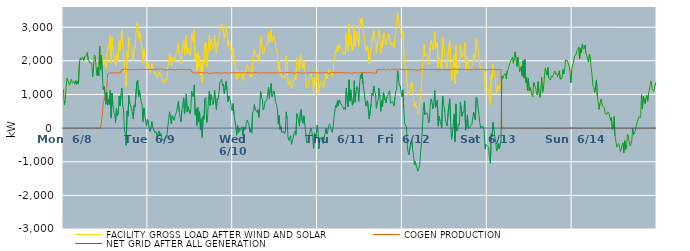
| Category | FACILITY GROSS LOAD AFTER WIND AND SOLAR | COGEN PRODUCTION | NET GRID AFTER ALL GENERATION |
|---|---|---|---|
|  Mon  6/8 | 1149 | 0 | 1149 |
|  Mon  6/8 | 692 | 0 | 692 |
|  Mon  6/8 | 806 | 0 | 806 |
|  Mon  6/8 | 1212 | 0 | 1212 |
|  Mon  6/8 | 1478 | 0 | 1478 |
|  Mon  6/8 | 1409 | 0 | 1409 |
|  Mon  6/8 | 1383 | 0 | 1383 |
|  Mon  6/8 | 1277 | 0 | 1277 |
|  Mon  6/8 | 1256 | 0 | 1256 |
|  Mon  6/8 | 1450 | 0 | 1450 |
|  Mon  6/8 | 1342 | 0 | 1342 |
|  Mon  6/8 | 1341 | 0 | 1341 |
|  Mon  6/8 | 1388 | 0 | 1388 |
|  Mon  6/8 | 1303 | 0 | 1303 |
|  Mon  6/8 | 1413 | 0 | 1413 |
|  Mon  6/8 | 1302 | 0 | 1302 |
|  Mon  6/8 | 1396 | 0 | 1396 |
|  Mon  6/8 | 1310 | 0 | 1310 |
|  Mon  6/8 | 1901 | 0 | 1901 |
|  Mon  6/8 | 2096 | 0 | 2096 |
|  Mon  6/8 | 2030 | 0 | 2030 |
|  Mon  6/8 | 2065 | 0 | 2065 |
|  Mon  6/8 | 2110 | 0 | 2110 |
|  Mon  6/8 | 2014 | 0 | 2014 |
|  Mon  6/8 | 2131 | 0 | 2131 |
|  Mon  6/8 | 2127 | 0 | 2127 |
|  Mon  6/8 | 2157 | 0 | 2157 |
|  Mon  6/8 | 2244 | 0 | 2244 |
|  Mon  6/8 | 2032 | 0 | 2032 |
|  Mon  6/8 | 1995 | 0 | 1995 |
|  Mon  6/8 | 1935 | 0 | 1935 |
|  Mon  6/8 | 1937 | 0 | 1937 |
|  Mon  6/8 | 1936 | 0 | 1936 |
|  Mon  6/8 | 1520 | 0 | 1520 |
|  Mon  6/8 | 1823 | 0 | 1823 |
|  Mon  6/8 | 2174 | 0 | 2174 |
|  Mon  6/8 | 2131 | 0 | 2131 |
|  Mon  6/8 | 1795 | 0 | 1795 |
|  Mon  6/8 | 1562 | 0 | 1562 |
|  Mon  6/8 | 1802 | 0 | 1802 |
|  Mon  6/8 | 1553 | 0 | 1553 |
|  Mon  6/8 | 2439 | 0 | 2439 |
|  Mon  6/8 | 1746 | 0 | 1746 |
|  Mon  6/8 | 2171 | 0 | 2171 |
|  Mon  6/8 | 2010 | 393 | 1617 |
|  Mon  6/8 | 1881 | 732 | 1149 |
|  Mon  6/8 | 1976 | 744 | 1232 |
|  Mon  6/8 | 1930 | 933 | 997 |
|  Mon  6/8 | 1753 | 1044 | 709 |
|  Mon  6/8 | 2226 | 1165 | 1061 |
|  Mon  6/8 | 2290 | 1608 | 682 |
|  Mon  6/8 | 2489 | 1632 | 857 |
|  Mon  6/8 | 2347 | 1638 | 709 |
|  Mon  6/8 | 2765 | 1636 | 1129 |
|  Mon  6/8 | 1937 | 1640 | 297 |
|  Mon  6/8 | 2681 | 1642 | 1039 |
|  Mon  6/8 | 2311 | 1638 | 673 |
|  Mon  6/8 | 2128 | 1663 | 465 |
|  Mon  6/8 | 2061 | 1644 | 417 |
|  Mon  6/8 | 1816 | 1650 | 166 |
|  Mon  6/8 | 2233 | 1641 | 592 |
|  Mon  6/8 | 1989 | 1627 | 362 |
|  Mon  6/8 | 2039 | 1643 | 396 |
|  Mon  6/8 | 2594 | 1640 | 954 |
|  Mon  6/8 | 2303 | 1636 | 667 |
|  Mon  6/8 | 2610 | 1636 | 974 |
|  Mon  6/8 | 2929 | 1741 | 1188 |
|  Mon  6/8 | 2434 | 1738 | 696 |
|  Mon  6/8 | 2251 | 1739 | 512 |
|  Mon  6/8 | 1725 | 1747 | -22 |
|  Mon  6/8 | 1593 | 1758 | -165 |
|  Mon  6/8 | 1234 | 1745 | -511 |
|  Mon  6/8 | 2251 | 1742 | 509 |
|  Mon  6/8 | 2103 | 1753 | 350 |
|  Mon  6/8 | 2705 | 1737 | 968 |
|  Mon  6/8 | 2470 | 1745 | 725 |
|  Mon  6/8 | 2462 | 1739 | 723 |
|  Mon  6/8 | 2335 | 1751 | 584 |
|  Mon  6/8 | 2182 | 1748 | 434 |
|  Mon  6/8 | 2011 | 1737 | 274 |
|  Mon  6/8 | 2413 | 1735 | 678 |
|  Mon  6/8 | 2374 | 1752 | 622 |
|  Mon  6/8 | 2386 | 1742 | 644 |
|  Mon  6/8 | 3116 | 1743 | 1373 |
|  Mon  6/8 | 3164 | 1739 | 1425 |
|  Mon  6/8 | 2669 | 1732 | 937 |
|  Mon  6/8 | 2870 | 1747 | 1123 |
|  Mon  6/8 | 2641 | 1732 | 909 |
|  Mon  6/8 | 2519 | 1745 | 774 |
|  Mon  6/8 | 2409 | 1742 | 667 |
|  Mon  6/8 | 1943 | 1750 | 193 |
|  Mon  6/8 | 2337 | 1739 | 598 |
|  Mon  6/8 | 2138 | 1744 | 394 |
|  Mon  6/8 | 1963 | 1750 | 213 |
|  Mon  6/8 | 1803 | 1746 | 57 |
|  Mon  6/8 | 1988 | 1725 | 263 |
|  Tue  6/9 | 1919 | 1735 | 184 |
|  Tue  6/9 | 1724 | 1736 | -12 |
|  Tue  6/9 | 1639 | 1744 | -105 |
|  Tue  6/9 | 1721 | 1743 | -22 |
|  Tue  6/9 | 1943 | 1747 | 196 |
|  Tue  6/9 | 1788 | 1763 | 25 |
|  Tue  6/9 | 1714 | 1735 | -21 |
|  Tue  6/9 | 1609 | 1731 | -122 |
|  Tue  6/9 | 1660 | 1753 | -93 |
|  Tue  6/9 | 1633 | 1745 | -112 |
|  Tue  6/9 | 1486 | 1755 | -269 |
|  Tue  6/9 | 1585 | 1755 | -170 |
|  Tue  6/9 | 1668 | 1754 | -86 |
|  Tue  6/9 | 1547 | 1755 | -208 |
|  Tue  6/9 | 1616 | 1761 | -145 |
|  Tue  6/9 | 1480 | 1744 | -264 |
|  Tue  6/9 | 1471 | 1754 | -283 |
|  Tue  6/9 | 1380 | 1759 | -379 |
|  Tue  6/9 | 1339 | 1738 | -399 |
|  Tue  6/9 | 1448 | 1750 | -302 |
|  Tue  6/9 | 1400 | 1723 | -323 |
|  Tue  6/9 | 1455 | 1730 | -275 |
|  Tue  6/9 | 1770 | 1736 | 34 |
|  Tue  6/9 | 1962 | 1729 | 233 |
|  Tue  6/9 | 2235 | 1752 | 483 |
|  Tue  6/9 | 2051 | 1732 | 319 |
|  Tue  6/9 | 1866 | 1740 | 126 |
|  Tue  6/9 | 2113 | 1744 | 369 |
|  Tue  6/9 | 2068 | 1739 | 329 |
|  Tue  6/9 | 1968 | 1737 | 231 |
|  Tue  6/9 | 2073 | 1728 | 345 |
|  Tue  6/9 | 2063 | 1740 | 323 |
|  Tue  6/9 | 2221 | 1737 | 484 |
|  Tue  6/9 | 2379 | 1730 | 649 |
|  Tue  6/9 | 2536 | 1744 | 792 |
|  Tue  6/9 | 2215 | 1729 | 486 |
|  Tue  6/9 | 2084 | 1743 | 341 |
|  Tue  6/9 | 1933 | 1753 | 180 |
|  Tue  6/9 | 2271 | 1746 | 525 |
|  Tue  6/9 | 2429 | 1732 | 697 |
|  Tue  6/9 | 2636 | 1734 | 902 |
|  Tue  6/9 | 2152 | 1734 | 418 |
|  Tue  6/9 | 2496 | 1738 | 758 |
|  Tue  6/9 | 2762 | 1744 | 1018 |
|  Tue  6/9 | 2205 | 1728 | 477 |
|  Tue  6/9 | 2371 | 1734 | 637 |
|  Tue  6/9 | 2396 | 1749 | 647 |
|  Tue  6/9 | 2161 | 1729 | 432 |
|  Tue  6/9 | 2248 | 1746 | 502 |
|  Tue  6/9 | 2830 | 1734 | 1096 |
|  Tue  6/9 | 2611 | 1647 | 964 |
|  Tue  6/9 | 2574 | 1648 | 926 |
|  Tue  6/9 | 2924 | 1639 | 1285 |
|  Tue  6/9 | 2042 | 1646 | 396 |
|  Tue  6/9 | 2208 | 1635 | 573 |
|  Tue  6/9 | 1707 | 1629 | 78 |
|  Tue  6/9 | 2250 | 1640 | 610 |
|  Tue  6/9 | 1831 | 1641 | 190 |
|  Tue  6/9 | 2128 | 1644 | 484 |
|  Tue  6/9 | 1589 | 1635 | -46 |
|  Tue  6/9 | 1935 | 1649 | 286 |
|  Tue  6/9 | 1357 | 1634 | -277 |
|  Tue  6/9 | 2001 | 1636 | 365 |
|  Tue  6/9 | 1903 | 1640 | 263 |
|  Tue  6/9 | 2503 | 1634 | 869 |
|  Tue  6/9 | 2560 | 1643 | 917 |
|  Tue  6/9 | 1817 | 1658 | 159 |
|  Tue  6/9 | 1929 | 1637 | 292 |
|  Tue  6/9 | 2455 | 1629 | 826 |
|  Tue  6/9 | 2749 | 1648 | 1101 |
|  Tue  6/9 | 2303 | 1631 | 672 |
|  Tue  6/9 | 2635 | 1636 | 999 |
|  Tue  6/9 | 2492 | 1638 | 854 |
|  Tue  6/9 | 2345 | 1651 | 694 |
|  Tue  6/9 | 2421 | 1633 | 788 |
|  Tue  6/9 | 2767 | 1644 | 1123 |
|  Tue  6/9 | 2425 | 1648 | 777 |
|  Tue  6/9 | 2215 | 1666 | 549 |
|  Tue  6/9 | 2527 | 1642 | 885 |
|  Tue  6/9 | 2483 | 1636 | 847 |
|  Tue  6/9 | 2685 | 1640 | 1045 |
|  Tue  6/9 | 3001 | 1636 | 1365 |
|  Tue  6/9 | 3038 | 1635 | 1403 |
|  Tue  6/9 | 3099 | 1647 | 1452 |
|  Tue  6/9 | 2881 | 1629 | 1252 |
|  Tue  6/9 | 2947 | 1636 | 1311 |
|  Tue  6/9 | 2666 | 1650 | 1016 |
|  Tue  6/9 | 2700 | 1655 | 1045 |
|  Tue  6/9 | 3030 | 1643 | 1387 |
|  Tue  6/9 | 2800 | 1650 | 1150 |
|  Tue  6/9 | 2414 | 1635 | 779 |
|  Tue  6/9 | 2601 | 1645 | 956 |
|  Tue  6/9 | 2505 | 1636 | 869 |
|  Tue  6/9 | 2451 | 1645 | 806 |
|  Tue  6/9 | 2242 | 1643 | 599 |
|  Tue  6/9 | 2164 | 1652 | 512 |
|  Wed  6/10 | 2378 | 1646 | 732 |
|  Wed  6/10 | 2049 | 1653 | 396 |
|  Wed  6/10 | 1858 | 1643 | 215 |
|  Wed  6/10 | 1694 | 1640 | 54 |
|  Wed  6/10 | 1436 | 1646 | -210 |
|  Wed  6/10 | 1713 | 1640 | 73 |
|  Wed  6/10 | 1501 | 1642 | -141 |
|  Wed  6/10 | 1639 | 1641 | -2 |
|  Wed  6/10 | 1559 | 1631 | -72 |
|  Wed  6/10 | 1595 | 1651 | -56 |
|  Wed  6/10 | 1685 | 1646 | 39 |
|  Wed  6/10 | 1417 | 1635 | -218 |
|  Wed  6/10 | 1676 | 1643 | 33 |
|  Wed  6/10 | 1577 | 1640 | -63 |
|  Wed  6/10 | 1636 | 1638 | -2 |
|  Wed  6/10 | 1846 | 1648 | 198 |
|  Wed  6/10 | 1891 | 1650 | 241 |
|  Wed  6/10 | 1901 | 1647 | 254 |
|  Wed  6/10 | 1715 | 1643 | 72 |
|  Wed  6/10 | 1527 | 1647 | -120 |
|  Wed  6/10 | 1614 | 1638 | -24 |
|  Wed  6/10 | 1510 | 1658 | -148 |
|  Wed  6/10 | 2097 | 1639 | 458 |
|  Wed  6/10 | 2149 | 1629 | 520 |
|  Wed  6/10 | 2348 | 1651 | 697 |
|  Wed  6/10 | 2188 | 1645 | 543 |
|  Wed  6/10 | 2180 | 1662 | 518 |
|  Wed  6/10 | 2114 | 1643 | 471 |
|  Wed  6/10 | 2186 | 1635 | 551 |
|  Wed  6/10 | 1958 | 1640 | 318 |
|  Wed  6/10 | 2220 | 1646 | 574 |
|  Wed  6/10 | 2736 | 1640 | 1096 |
|  Wed  6/10 | 2549 | 1628 | 921 |
|  Wed  6/10 | 2492 | 1636 | 856 |
|  Wed  6/10 | 2193 | 1655 | 538 |
|  Wed  6/10 | 2260 | 1646 | 614 |
|  Wed  6/10 | 2424 | 1631 | 793 |
|  Wed  6/10 | 2440 | 1635 | 805 |
|  Wed  6/10 | 2454 | 1637 | 817 |
|  Wed  6/10 | 2647 | 1633 | 1014 |
|  Wed  6/10 | 2857 | 1651 | 1206 |
|  Wed  6/10 | 2531 | 1648 | 883 |
|  Wed  6/10 | 2801 | 1635 | 1166 |
|  Wed  6/10 | 2952 | 1628 | 1324 |
|  Wed  6/10 | 2574 | 1644 | 930 |
|  Wed  6/10 | 2638 | 1658 | 980 |
|  Wed  6/10 | 2745 | 1638 | 1107 |
|  Wed  6/10 | 2632 | 1630 | 1002 |
|  Wed  6/10 | 2412 | 1648 | 764 |
|  Wed  6/10 | 2347 | 1639 | 708 |
|  Wed  6/10 | 2209 | 1640 | 569 |
|  Wed  6/10 | 1747 | 1630 | 117 |
|  Wed  6/10 | 2025 | 1641 | 384 |
|  Wed  6/10 | 1592 | 1635 | -43 |
|  Wed  6/10 | 1694 | 1645 | 49 |
|  Wed  6/10 | 1504 | 1641 | -137 |
|  Wed  6/10 | 1480 | 1644 | -164 |
|  Wed  6/10 | 1554 | 1635 | -81 |
|  Wed  6/10 | 1466 | 1633 | -167 |
|  Wed  6/10 | 1546 | 1655 | -109 |
|  Wed  6/10 | 2133 | 1650 | 483 |
|  Wed  6/10 | 1906 | 1622 | 284 |
|  Wed  6/10 | 1388 | 1654 | -266 |
|  Wed  6/10 | 1283 | 1652 | -369 |
|  Wed  6/10 | 1361 | 1639 | -278 |
|  Wed  6/10 | 1418 | 1645 | -227 |
|  Wed  6/10 | 1178 | 1662 | -484 |
|  Wed  6/10 | 1266 | 1633 | -367 |
|  Wed  6/10 | 1359 | 1636 | -277 |
|  Wed  6/10 | 1511 | 1649 | -138 |
|  Wed  6/10 | 1545 | 1634 | -89 |
|  Wed  6/10 | 1433 | 1642 | -209 |
|  Wed  6/10 | 2067 | 1640 | 427 |
|  Wed  6/10 | 2007 | 1637 | 370 |
|  Wed  6/10 | 1999 | 1647 | 352 |
|  Wed  6/10 | 1703 | 1648 | 55 |
|  Wed  6/10 | 2136 | 1647 | 489 |
|  Wed  6/10 | 2181 | 1629 | 552 |
|  Wed  6/10 | 1849 | 1630 | 219 |
|  Wed  6/10 | 1768 | 1628 | 140 |
|  Wed  6/10 | 1999 | 1633 | 366 |
|  Wed  6/10 | 1750 | 1639 | 111 |
|  Wed  6/10 | 1553 | 1644 | -91 |
|  Wed  6/10 | 1209 | 1639 | -430 |
|  Wed  6/10 | 1231 | 1636 | -405 |
|  Wed  6/10 | 1248 | 1640 | -392 |
|  Wed  6/10 | 1438 | 1640 | -202 |
|  Wed  6/10 | 1450 | 1649 | -199 |
|  Wed  6/10 | 1642 | 1646 | -4 |
|  Wed  6/10 | 1529 | 1630 | -101 |
|  Wed  6/10 | 1361 | 1639 | -278 |
|  Wed  6/10 | 1038 | 1641 | -603 |
|  Wed  6/10 | 1503 | 1653 | -150 |
|  Wed  6/10 | 1261 | 1646 | -385 |
|  Wed  6/10 | 1465 | 1646 | -181 |
|  Wed  6/10 | 1725 | 1641 | 84 |
|  Thu  6/11 | 1524 | 1629 | -105 |
|  Thu  6/11 | 1020 | 1636 | -616 |
|  Thu  6/11 | 1302 | 1650 | -348 |
|  Thu  6/11 | 1376 | 1658 | -282 |
|  Thu  6/11 | 1314 | 1633 | -319 |
|  Thu  6/11 | 1265 | 1638 | -373 |
|  Thu  6/11 | 1198 | 1650 | -452 |
|  Thu  6/11 | 1386 | 1652 | -266 |
|  Thu  6/11 | 1459 | 1649 | -190 |
|  Thu  6/11 | 1631 | 1640 | -9 |
|  Thu  6/11 | 1470 | 1640 | -170 |
|  Thu  6/11 | 1550 | 1650 | -100 |
|  Thu  6/11 | 1700 | 1630 | 70 |
|  Thu  6/11 | 1763 | 1639 | 124 |
|  Thu  6/11 | 1716 | 1639 | 77 |
|  Thu  6/11 | 1576 | 1652 | -76 |
|  Thu  6/11 | 1534 | 1662 | -128 |
|  Thu  6/11 | 1643 | 1646 | -3 |
|  Thu  6/11 | 1950 | 1643 | 307 |
|  Thu  6/11 | 2137 | 1655 | 482 |
|  Thu  6/11 | 2325 | 1641 | 684 |
|  Thu  6/11 | 2256 | 1641 | 615 |
|  Thu  6/11 | 2471 | 1658 | 813 |
|  Thu  6/11 | 2287 | 1631 | 656 |
|  Thu  6/11 | 2485 | 1647 | 838 |
|  Thu  6/11 | 2411 | 1640 | 771 |
|  Thu  6/11 | 2366 | 1645 | 721 |
|  Thu  6/11 | 2362 | 1640 | 722 |
|  Thu  6/11 | 2291 | 1650 | 641 |
|  Thu  6/11 | 2191 | 1637 | 554 |
|  Thu  6/11 | 2267 | 1649 | 618 |
|  Thu  6/11 | 2192 | 1643 | 549 |
|  Thu  6/11 | 2824 | 1634 | 1190 |
|  Thu  6/11 | 2501 | 1640 | 861 |
|  Thu  6/11 | 2285 | 1652 | 633 |
|  Thu  6/11 | 3082 | 1647 | 1435 |
|  Thu  6/11 | 2442 | 1640 | 802 |
|  Thu  6/11 | 2779 | 1641 | 1138 |
|  Thu  6/11 | 2786 | 1627 | 1159 |
|  Thu  6/11 | 2312 | 1635 | 677 |
|  Thu  6/11 | 2368 | 1636 | 732 |
|  Thu  6/11 | 3056 | 1648 | 1408 |
|  Thu  6/11 | 2424 | 1655 | 769 |
|  Thu  6/11 | 2709 | 1627 | 1082 |
|  Thu  6/11 | 2878 | 1637 | 1241 |
|  Thu  6/11 | 2855 | 1650 | 1205 |
|  Thu  6/11 | 2425 | 1636 | 789 |
|  Thu  6/11 | 2930 | 1642 | 1288 |
|  Thu  6/11 | 3237 | 1651 | 1586 |
|  Thu  6/11 | 3118 | 1642 | 1476 |
|  Thu  6/11 | 3285 | 1650 | 1635 |
|  Thu  6/11 | 2954 | 1644 | 1310 |
|  Thu  6/11 | 2787 | 1657 | 1130 |
|  Thu  6/11 | 2778 | 1630 | 1148 |
|  Thu  6/11 | 2297 | 1641 | 656 |
|  Thu  6/11 | 2310 | 1642 | 668 |
|  Thu  6/11 | 2456 | 1645 | 811 |
|  Thu  6/11 | 2475 | 1649 | 826 |
|  Thu  6/11 | 1916 | 1645 | 271 |
|  Thu  6/11 | 1928 | 1636 | 292 |
|  Thu  6/11 | 2357 | 1644 | 713 |
|  Thu  6/11 | 2671 | 1637 | 1034 |
|  Thu  6/11 | 2601 | 1640 | 961 |
|  Thu  6/11 | 2896 | 1645 | 1251 |
|  Thu  6/11 | 2739 | 1629 | 1110 |
|  Thu  6/11 | 2665 | 1650 | 1015 |
|  Thu  6/11 | 2226 | 1639 | 587 |
|  Thu  6/11 | 2543 | 1748 | 795 |
|  Thu  6/11 | 2566 | 1737 | 829 |
|  Thu  6/11 | 2924 | 1735 | 1189 |
|  Thu  6/11 | 2677 | 1750 | 927 |
|  Thu  6/11 | 2239 | 1741 | 498 |
|  Thu  6/11 | 2578 | 1750 | 828 |
|  Thu  6/11 | 2386 | 1743 | 643 |
|  Thu  6/11 | 2803 | 1742 | 1061 |
|  Thu  6/11 | 2838 | 1754 | 1084 |
|  Thu  6/11 | 2562 | 1734 | 828 |
|  Thu  6/11 | 2476 | 1724 | 752 |
|  Thu  6/11 | 2659 | 1724 | 935 |
|  Thu  6/11 | 2739 | 1758 | 981 |
|  Thu  6/11 | 2811 | 1750 | 1061 |
|  Thu  6/11 | 2827 | 1719 | 1108 |
|  Thu  6/11 | 2477 | 1744 | 733 |
|  Thu  6/11 | 2488 | 1746 | 742 |
|  Thu  6/11 | 2529 | 1741 | 788 |
|  Thu  6/11 | 2514 | 1743 | 771 |
|  Thu  6/11 | 2397 | 1729 | 668 |
|  Thu  6/11 | 2675 | 1764 | 911 |
|  Thu  6/11 | 2861 | 1761 | 1100 |
|  Thu  6/11 | 2881 | 1727 | 1154 |
|  Thu  6/11 | 3451 | 1747 | 1704 |
|  Thu  6/11 | 3211 | 1736 | 1475 |
|  Thu  6/11 | 3059 | 1778 | 1281 |
|  Thu  6/11 | 3011 | 1761 | 1250 |
|  Thu  6/11 | 2995 | 1739 | 1256 |
|  Thu  6/11 | 2662 | 1730 | 932 |
|  Fri  6/12 | 2879 | 1743 | 1136 |
|  Fri  6/12 | 2324 | 1732 | 592 |
|  Fri  6/12 | 1870 | 1729 | 141 |
|  Fri  6/12 | 1884 | 1741 | 143 |
|  Fri  6/12 | 1780 | 1746 | 34 |
|  Fri  6/12 | 1202 | 1753 | -551 |
|  Fri  6/12 | 1017 | 1742 | -725 |
|  Fri  6/12 | 962 | 1756 | -794 |
|  Fri  6/12 | 1183 | 1750 | -567 |
|  Fri  6/12 | 1315 | 1735 | -420 |
|  Fri  6/12 | 1388 | 1731 | -343 |
|  Fri  6/12 | 1100 | 1730 | -630 |
|  Fri  6/12 | 948 | 1750 | -802 |
|  Fri  6/12 | 632 | 1717 | -1085 |
|  Fri  6/12 | 756 | 1752 | -996 |
|  Fri  6/12 | 609 | 1722 | -1113 |
|  Fri  6/12 | 645 | 1734 | -1089 |
|  Fri  6/12 | 445 | 1725 | -1280 |
|  Fri  6/12 | 407 | 1706 | -1299 |
|  Fri  6/12 | 627 | 1729 | -1102 |
|  Fri  6/12 | 1005 | 1748 | -743 |
|  Fri  6/12 | 1308 | 1740 | -432 |
|  Fri  6/12 | 1673 | 1734 | -61 |
|  Fri  6/12 | 2245 | 1754 | 491 |
|  Fri  6/12 | 2491 | 1733 | 758 |
|  Fri  6/12 | 2139 | 1745 | 394 |
|  Fri  6/12 | 2151 | 1747 | 404 |
|  Fri  6/12 | 2201 | 1740 | 461 |
|  Fri  6/12 | 2146 | 1737 | 409 |
|  Fri  6/12 | 1895 | 1742 | 153 |
|  Fri  6/12 | 1916 | 1733 | 183 |
|  Fri  6/12 | 2415 | 1743 | 672 |
|  Fri  6/12 | 2599 | 1731 | 868 |
|  Fri  6/12 | 2505 | 1741 | 764 |
|  Fri  6/12 | 2324 | 1749 | 575 |
|  Fri  6/12 | 2436 | 1738 | 698 |
|  Fri  6/12 | 2868 | 1747 | 1121 |
|  Fri  6/12 | 2364 | 1754 | 610 |
|  Fri  6/12 | 2336 | 1721 | 615 |
|  Fri  6/12 | 2561 | 1731 | 830 |
|  Fri  6/12 | 1800 | 1744 | 56 |
|  Fri  6/12 | 2101 | 1753 | 348 |
|  Fri  6/12 | 1959 | 1741 | 218 |
|  Fri  6/12 | 1842 | 1732 | 110 |
|  Fri  6/12 | 1750 | 1738 | 12 |
|  Fri  6/12 | 2706 | 1751 | 955 |
|  Fri  6/12 | 2476 | 1747 | 729 |
|  Fri  6/12 | 2360 | 1746 | 614 |
|  Fri  6/12 | 2008 | 1734 | 274 |
|  Fri  6/12 | 1988 | 1740 | 248 |
|  Fri  6/12 | 1797 | 1735 | 62 |
|  Fri  6/12 | 1790 | 1725 | 65 |
|  Fri  6/12 | 2433 | 1740 | 693 |
|  Fri  6/12 | 2606 | 1734 | 872 |
|  Fri  6/12 | 1942 | 1733 | 209 |
|  Fri  6/12 | 1408 | 1746 | -338 |
|  Fri  6/12 | 1608 | 1748 | -140 |
|  Fri  6/12 | 1823 | 1750 | 73 |
|  Fri  6/12 | 2177 | 1756 | 421 |
|  Fri  6/12 | 1323 | 1732 | -409 |
|  Fri  6/12 | 2466 | 1748 | 718 |
|  Fri  6/12 | 1644 | 1734 | -90 |
|  Fri  6/12 | 1717 | 1741 | -24 |
|  Fri  6/12 | 1879 | 1753 | 126 |
|  Fri  6/12 | 1832 | 1740 | 92 |
|  Fri  6/12 | 2501 | 1732 | 769 |
|  Fri  6/12 | 2509 | 1743 | 766 |
|  Fri  6/12 | 2106 | 1752 | 354 |
|  Fri  6/12 | 2222 | 1744 | 478 |
|  Fri  6/12 | 2269 | 1749 | 520 |
|  Fri  6/12 | 2550 | 1739 | 811 |
|  Fri  6/12 | 1671 | 1738 | -67 |
|  Fri  6/12 | 1882 | 1736 | 146 |
|  Fri  6/12 | 2125 | 1733 | 392 |
|  Fri  6/12 | 1735 | 1744 | -9 |
|  Fri  6/12 | 1729 | 1748 | -19 |
|  Fri  6/12 | 1797 | 1750 | 47 |
|  Fri  6/12 | 1796 | 1744 | 52 |
|  Fri  6/12 | 1827 | 1723 | 104 |
|  Fri  6/12 | 1874 | 1741 | 133 |
|  Fri  6/12 | 2217 | 1747 | 470 |
|  Fri  6/12 | 2242 | 1753 | 489 |
|  Fri  6/12 | 2009 | 1758 | 251 |
|  Fri  6/12 | 2661 | 1744 | 917 |
|  Fri  6/12 | 2623 | 1745 | 878 |
|  Fri  6/12 | 2366 | 1732 | 634 |
|  Fri  6/12 | 2143 | 1741 | 402 |
|  Fri  6/12 | 1904 | 1736 | 168 |
|  Fri  6/12 | 1748 | 1750 | -2 |
|  Fri  6/12 | 1781 | 1736 | 45 |
|  Fri  6/12 | 1822 | 1755 | 67 |
|  Fri  6/12 | 1790 | 1751 | 39 |
|  Fri  6/12 | 1669 | 1748 | -79 |
|  Fri  6/12 | 1119 | 1740 | -621 |
|  Fri  6/12 | 1251 | 1738 | -487 |
|  Fri  6/12 | 1225 | 1746 | -521 |
|  Sat  6/13 | 1209 | 1723 | -514 |
|  Sat  6/13 | 1179 | 1754 | -575 |
|  Sat  6/13 | 860 | 1737 | -877 |
|  Sat  6/13 | 698 | 1744 | -1046 |
|  Sat  6/13 | 1582 | 1743 | -161 |
|  Sat  6/13 | 1483 | 1738 | -255 |
|  Sat  6/13 | 1910 | 1740 | 170 |
|  Sat  6/13 | 1711 | 1747 | -36 |
|  Sat  6/13 | 1532 | 1763 | -231 |
|  Sat  6/13 | 1349 | 1742 | -393 |
|  Sat  6/13 | 1046 | 1731 | -685 |
|  Sat  6/13 | 1029 | 1734 | -705 |
|  Sat  6/13 | 1265 | 1726 | -461 |
|  Sat  6/13 | 1127 | 1744 | -617 |
|  Sat  6/13 | 1151 | 1739 | -588 |
|  Sat  6/13 | 1367 | 1737 | -370 |
|  Sat  6/13 | 1555 | 0 | 1555 |
|  Sat  6/13 | 1477 | 0 | 1477 |
|  Sat  6/13 | 1555 | 0 | 1555 |
|  Sat  6/13 | 1528 | 0 | 1528 |
|  Sat  6/13 | 1622 | 0 | 1622 |
|  Sat  6/13 | 1472 | 0 | 1472 |
|  Sat  6/13 | 1697 | 0 | 1697 |
|  Sat  6/13 | 1734 | 0 | 1734 |
|  Sat  6/13 | 1842 | 0 | 1842 |
|  Sat  6/13 | 1929 | 0 | 1929 |
|  Sat  6/13 | 1990 | 0 | 1990 |
|  Sat  6/13 | 2055 | 0 | 2055 |
|  Sat  6/13 | 2108 | 0 | 2108 |
|  Sat  6/13 | 1929 | 0 | 1929 |
|  Sat  6/13 | 2090 | 0 | 2090 |
|  Sat  6/13 | 2268 | 0 | 2268 |
|  Sat  6/13 | 2065 | 0 | 2065 |
|  Sat  6/13 | 1833 | 0 | 1833 |
|  Sat  6/13 | 2111 | 0 | 2111 |
|  Sat  6/13 | 1962 | 0 | 1962 |
|  Sat  6/13 | 1673 | 0 | 1673 |
|  Sat  6/13 | 1774 | 0 | 1774 |
|  Sat  6/13 | 1835 | 0 | 1835 |
|  Sat  6/13 | 1545 | 0 | 1545 |
|  Sat  6/13 | 2003 | 0 | 2003 |
|  Sat  6/13 | 1484 | 0 | 1484 |
|  Sat  6/13 | 2043 | 0 | 2043 |
|  Sat  6/13 | 1356 | 0 | 1356 |
|  Sat  6/13 | 1522 | 0 | 1522 |
|  Sat  6/13 | 1120 | 0 | 1120 |
|  Sat  6/13 | 1480 | 0 | 1480 |
|  Sat  6/13 | 1105 | 0 | 1105 |
|  Sat  6/13 | 1202 | 0 | 1202 |
|  Sat  6/13 | 1099 | 0 | 1099 |
|  Sat  6/13 | 976 | 0 | 976 |
|  Sat  6/13 | 930 | 0 | 930 |
|  Sat  6/13 | 1359 | 0 | 1359 |
|  Sat  6/13 | 1282 | 0 | 1282 |
|  Sat  6/13 | 1216 | 0 | 1216 |
|  Sat  6/13 | 1075 | 0 | 1075 |
|  Sat  6/13 | 989 | 0 | 989 |
|  Sat  6/13 | 1381 | 0 | 1381 |
|  Sat  6/13 | 1071 | 0 | 1071 |
|  Sat  6/13 | 909 | 0 | 909 |
|  Sat  6/13 | 1109 | 0 | 1109 |
|  Sat  6/13 | 1507 | 0 | 1507 |
|  Sat  6/13 | 1062 | 0 | 1062 |
|  Sat  6/13 | 1182 | 0 | 1182 |
|  Sat  6/13 | 1465 | 0 | 1465 |
|  Sat  6/13 | 1773 | 0 | 1773 |
|  Sat  6/13 | 1697 | 0 | 1697 |
|  Sat  6/13 | 1572 | 0 | 1572 |
|  Sat  6/13 | 1800 | 0 | 1800 |
|  Sat  6/13 | 1487 | 0 | 1487 |
|  Sat  6/13 | 1504 | 0 | 1504 |
|  Sat  6/13 | 1427 | 0 | 1427 |
|  Sat  6/13 | 1551 | 0 | 1551 |
|  Sat  6/13 | 1512 | 0 | 1512 |
|  Sat  6/13 | 1523 | 0 | 1523 |
|  Sat  6/13 | 1642 | 0 | 1642 |
|  Sat  6/13 | 1702 | 0 | 1702 |
|  Sat  6/13 | 1595 | 0 | 1595 |
|  Sat  6/13 | 1632 | 0 | 1632 |
|  Sat  6/13 | 1527 | 0 | 1527 |
|  Sat  6/13 | 1611 | 0 | 1611 |
|  Sat  6/13 | 1708 | 0 | 1708 |
|  Sat  6/13 | 1455 | 0 | 1455 |
|  Sat  6/13 | 1453 | 0 | 1453 |
|  Sat  6/13 | 1477 | 0 | 1477 |
|  Sat  6/13 | 1740 | 0 | 1740 |
|  Sat  6/13 | 1610 | 0 | 1610 |
|  Sat  6/13 | 1752 | 0 | 1752 |
|  Sat  6/13 | 2026 | 0 | 2026 |
|  Sat  6/13 | 2042 | 0 | 2042 |
|  Sat  6/13 | 2009 | 0 | 2009 |
|  Sat  6/13 | 2026 | 0 | 2026 |
|  Sat  6/13 | 1849 | 0 | 1849 |
|  Sat  6/13 | 1717 | 0 | 1717 |
|  Sat  6/13 | 1345 | 0 | 1345 |
|  Sat  6/13 | 1712 | 0 | 1712 |
|  Sun  6/14 | 1875 | 0 | 1875 |
|  Sun  6/14 | 1945 | 0 | 1945 |
|  Sun  6/14 | 2111 | 0 | 2111 |
|  Sun  6/14 | 2111 | 0 | 2111 |
|  Sun  6/14 | 2204 | 0 | 2204 |
|  Sun  6/14 | 2302 | 0 | 2302 |
|  Sun  6/14 | 2340 | 0 | 2340 |
|  Sun  6/14 | 2413 | 0 | 2413 |
|  Sun  6/14 | 2055 | 0 | 2055 |
|  Sun  6/14 | 2362 | 0 | 2362 |
|  Sun  6/14 | 2239 | 0 | 2239 |
|  Sun  6/14 | 2502 | 0 | 2502 |
|  Sun  6/14 | 2390 | 0 | 2390 |
|  Sun  6/14 | 2350 | 0 | 2350 |
|  Sun  6/14 | 2471 | 0 | 2471 |
|  Sun  6/14 | 2242 | 0 | 2242 |
|  Sun  6/14 | 2270 | 0 | 2270 |
|  Sun  6/14 | 2080 | 0 | 2080 |
|  Sun  6/14 | 1961 | 0 | 1961 |
|  Sun  6/14 | 2189 | 0 | 2189 |
|  Sun  6/14 | 2135 | 0 | 2135 |
|  Sun  6/14 | 1811 | 0 | 1811 |
|  Sun  6/14 | 1585 | 0 | 1585 |
|  Sun  6/14 | 1259 | 0 | 1259 |
|  Sun  6/14 | 1204 | 0 | 1204 |
|  Sun  6/14 | 1063 | 0 | 1063 |
|  Sun  6/14 | 1051 | 0 | 1051 |
|  Sun  6/14 | 1428 | 0 | 1428 |
|  Sun  6/14 | 954 | 0 | 954 |
|  Sun  6/14 | 939 | 0 | 939 |
|  Sun  6/14 | 555 | 0 | 555 |
|  Sun  6/14 | 735 | 0 | 735 |
|  Sun  6/14 | 859 | 0 | 859 |
|  Sun  6/14 | 759 | 0 | 759 |
|  Sun  6/14 | 642 | 0 | 642 |
|  Sun  6/14 | 637 | 0 | 637 |
|  Sun  6/14 | 608 | 0 | 608 |
|  Sun  6/14 | 420 | 0 | 420 |
|  Sun  6/14 | 412 | 0 | 412 |
|  Sun  6/14 | 414 | 0 | 414 |
|  Sun  6/14 | 485 | 0 | 485 |
|  Sun  6/14 | 450 | 0 | 450 |
|  Sun  6/14 | 445 | 0 | 445 |
|  Sun  6/14 | 221 | 0 | 221 |
|  Sun  6/14 | 328 | 0 | 328 |
|  Sun  6/14 | -59 | 0 | -59 |
|  Sun  6/14 | -16 | 0 | -16 |
|  Sun  6/14 | 348 | 0 | 348 |
|  Sun  6/14 | -236 | 0 | -236 |
|  Sun  6/14 | -385 | 0 | -385 |
|  Sun  6/14 | -567 | 0 | -567 |
|  Sun  6/14 | -545 | 0 | -545 |
|  Sun  6/14 | -456 | 0 | -456 |
|  Sun  6/14 | -524 | 0 | -524 |
|  Sun  6/14 | -698 | 0 | -698 |
|  Sun  6/14 | -635 | 0 | -635 |
|  Sun  6/14 | -507 | 0 | -507 |
|  Sun  6/14 | -442 | 0 | -442 |
|  Sun  6/14 | -733 | 0 | -733 |
|  Sun  6/14 | -374 | 0 | -374 |
|  Sun  6/14 | -646 | 0 | -646 |
|  Sun  6/14 | -602 | 0 | -602 |
|  Sun  6/14 | -184 | 0 | -184 |
|  Sun  6/14 | -260 | 0 | -260 |
|  Sun  6/14 | -284 | 0 | -284 |
|  Sun  6/14 | -533 | 0 | -533 |
|  Sun  6/14 | -476 | 0 | -476 |
|  Sun  6/14 | -364 | 0 | -364 |
|  Sun  6/14 | -13 | 0 | -13 |
|  Sun  6/14 | -193 | 0 | -193 |
|  Sun  6/14 | -206 | 0 | -206 |
|  Sun  6/14 | -78 | 0 | -78 |
|  Sun  6/14 | 85 | 0 | 85 |
|  Sun  6/14 | 156 | 0 | 156 |
|  Sun  6/14 | 164 | 0 | 164 |
|  Sun  6/14 | 340 | 0 | 340 |
|  Sun  6/14 | 328 | 0 | 328 |
|  Sun  6/14 | 313 | 0 | 313 |
|  Sun  6/14 | 993 | 0 | 993 |
|  Sun  6/14 | 567 | 0 | 567 |
|  Sun  6/14 | 943 | 0 | 943 |
|  Sun  6/14 | 931 | 0 | 931 |
|  Sun  6/14 | 731 | 0 | 731 |
|  Sun  6/14 | 897 | 0 | 897 |
|  Sun  6/14 | 975 | 0 | 975 |
|  Sun  6/14 | 795 | 0 | 795 |
|  Sun  6/14 | 1042 | 0 | 1042 |
|  Sun  6/14 | 1153 | 0 | 1153 |
|  Sun  6/14 | 1338 | 0 | 1338 |
|  Sun  6/14 | 1397 | 0 | 1397 |
|  Sun  6/14 | 1175 | 0 | 1175 |
|  Sun  6/14 | 1154 | 0 | 1154 |
|  Sun  6/14 | 1084 | 0 | 1084 |
|  Sun  6/14 | 1246 | 0 | 1246 |
|  Sun  6/14 | 1234 | 0 | 1234 |
|  Sun  6/14 | 1398 | 0 | 1398 |